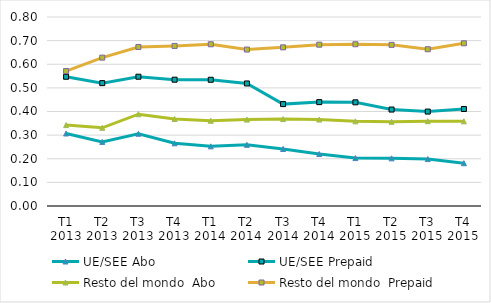
| Category | UE/SEE | Resto del mondo  |
|---|---|---|
| T1 2013 | 0.547 | 0.571 |
| T2 2013 | 0.52 | 0.628 |
| T3 2013 | 0.547 | 0.673 |
| T4 2013 | 0.535 | 0.678 |
| T1 2014 | 0.534 | 0.685 |
| T2 2014 | 0.519 | 0.662 |
| T3 2014 | 0.431 | 0.672 |
| T4 2014 | 0.44 | 0.683 |
| T1 2015 | 0.439 | 0.685 |
| T2 2015 | 0.408 | 0.682 |
| T3 2015 | 0.4 | 0.663 |
| T4 2015 | 0.411 | 0.689 |